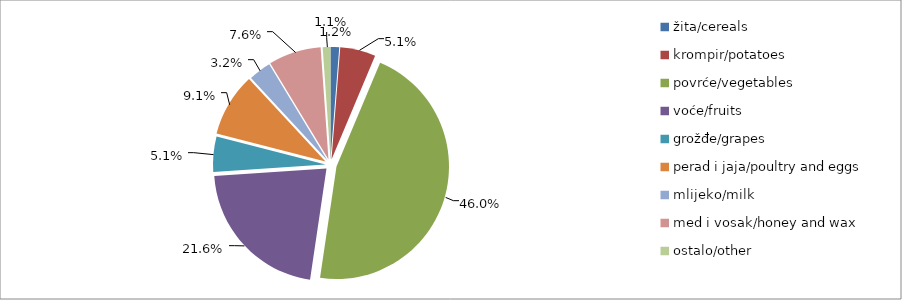
| Category | Series 0 |
|---|---|
| žita/cereals | 21518 |
| krompir/potatoes | 88238 |
| povrće/vegetables | 796780 |
| voće/fruits | 373931 |
| grožđe/grapes | 87957 |
| perad i jaja/poultry and eggs | 157590 |
| mlijeko/milk | 55986 |
| med i vosak/honey and wax | 130820 |
| ostalo/other | 19295 |